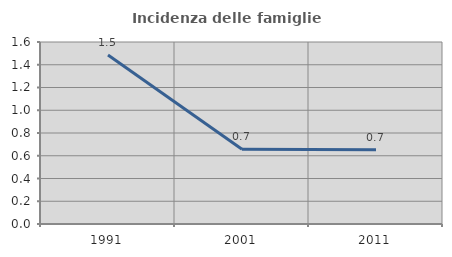
| Category | Incidenza delle famiglie numerose |
|---|---|
| 1991.0 | 1.486 |
| 2001.0 | 0.656 |
| 2011.0 | 0.652 |